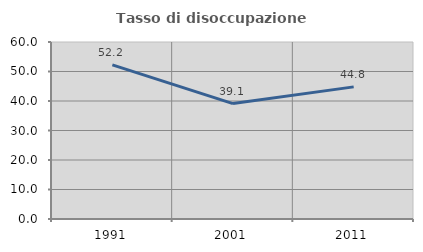
| Category | Tasso di disoccupazione giovanile  |
|---|---|
| 1991.0 | 52.222 |
| 2001.0 | 39.13 |
| 2011.0 | 44.792 |